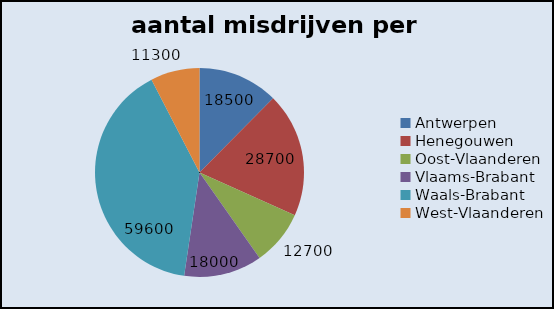
| Category | aantal |
|---|---|
| Antwerpen | 18500 |
| Henegouwen | 28700 |
| Oost-Vlaanderen | 12700 |
| Vlaams-Brabant | 18000 |
| Waals-Brabant | 59600 |
| West-Vlaanderen | 11300 |